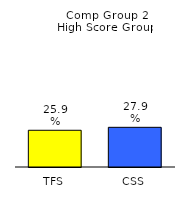
| Category | Series 0 |
|---|---|
| TFS | 0.259 |
| CSS | 0.279 |